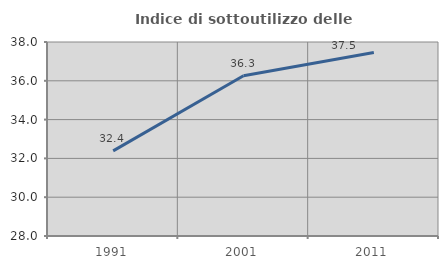
| Category | Indice di sottoutilizzo delle abitazioni  |
|---|---|
| 1991.0 | 32.389 |
| 2001.0 | 36.264 |
| 2011.0 | 37.454 |